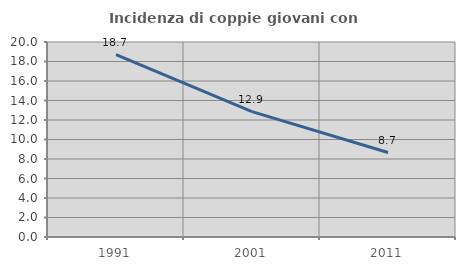
| Category | Incidenza di coppie giovani con figli |
|---|---|
| 1991.0 | 18.709 |
| 2001.0 | 12.862 |
| 2011.0 | 8.661 |